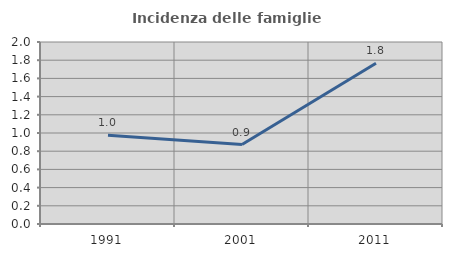
| Category | Incidenza delle famiglie numerose |
|---|---|
| 1991.0 | 0.976 |
| 2001.0 | 0.873 |
| 2011.0 | 1.767 |